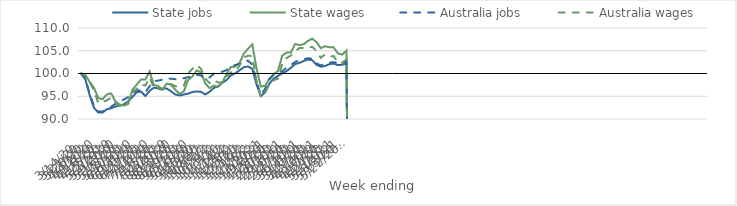
| Category | State jobs | State wages | Australia jobs | Australia wages |
|---|---|---|---|---|
| 14/03/2020 | 100 | 100 | 100 | 100 |
| 21/03/2020 | 98.645 | 99.612 | 98.971 | 99.605 |
| 28/03/2020 | 95.23 | 98.177 | 95.467 | 98.107 |
| 04/04/2020 | 92.458 | 96.854 | 92.92 | 96.258 |
| 11/04/2020 | 91.412 | 94.587 | 91.648 | 93.491 |
| 18/04/2020 | 91.415 | 94.369 | 91.631 | 93.694 |
| 25/04/2020 | 92.14 | 95.412 | 92.162 | 94.113 |
| 02/05/2020 | 92.362 | 95.687 | 92.658 | 94.675 |
| 09/05/2020 | 92.731 | 93.881 | 93.343 | 93.583 |
| 16/05/2020 | 92.971 | 93.182 | 93.936 | 92.817 |
| 23/05/2020 | 93.228 | 92.931 | 94.293 | 92.47 |
| 30/05/2020 | 93.894 | 93.318 | 94.8 | 93.82 |
| 06/06/2020 | 94.862 | 96.443 | 95.784 | 95.934 |
| 13/06/2020 | 95.893 | 97.556 | 96.283 | 96.613 |
| 20/06/2020 | 96.026 | 98.698 | 96.299 | 97.596 |
| 27/06/2020 | 95.046 | 98.676 | 95.908 | 97.351 |
| 04/07/2020 | 96.188 | 100.46 | 97.201 | 99.182 |
| 11/07/2020 | 96.879 | 97.457 | 98.328 | 96.791 |
| 18/07/2020 | 96.75 | 97.266 | 98.432 | 96.609 |
| 25/07/2020 | 96.654 | 96.48 | 98.653 | 96.408 |
| 01/08/2020 | 96.705 | 97.768 | 98.875 | 97.263 |
| 08/08/2020 | 96.089 | 97.528 | 98.872 | 97.698 |
| 15/08/2020 | 95.382 | 96.436 | 98.757 | 97.212 |
| 22/08/2020 | 95.169 | 95.517 | 98.844 | 97.073 |
| 29/08/2020 | 95.382 | 96.082 | 98.982 | 97.295 |
| 05/09/2020 | 95.578 | 98.534 | 99.167 | 100.035 |
| 12/09/2020 | 95.922 | 99.364 | 99.586 | 101.016 |
| 19/09/2020 | 96.056 | 100.663 | 99.757 | 101.878 |
| 26/09/2020 | 95.976 | 100.264 | 99.556 | 101.032 |
| 03/10/2020 | 95.4 | 97.844 | 98.852 | 98.907 |
| 10/10/2020 | 95.984 | 96.793 | 99.105 | 97.892 |
| 17/10/2020 | 96.819 | 97.346 | 99.955 | 98.589 |
| 24/10/2020 | 97.188 | 97.065 | 100.247 | 98.012 |
| 31/10/2020 | 97.953 | 98.015 | 100.384 | 98.084 |
| 07/11/2020 | 98.586 | 99.946 | 100.771 | 99.334 |
| 14/11/2020 | 99.582 | 101.418 | 101.516 | 100.252 |
| 21/11/2020 | 100.051 | 101.513 | 101.84 | 100.323 |
| 28/11/2020 | 100.675 | 102.274 | 102.16 | 101.68 |
| 05/12/2020 | 101.371 | 104.35 | 102.718 | 103.493 |
| 12/12/2020 | 101.554 | 105.429 | 102.789 | 103.93 |
| 19/12/2020 | 101.016 | 106.401 | 101.986 | 103.809 |
| 26/12/2020 | 97.585 | 101.1 | 98.188 | 98.338 |
| 02/01/2021 | 95.045 | 97.14 | 95.282 | 94.812 |
| 09/01/2021 | 95.855 | 97.301 | 96.645 | 95.793 |
| 16/01/2021 | 97.781 | 98.888 | 98.738 | 97.83 |
| 23/01/2021 | 98.866 | 99.832 | 99.703 | 98.519 |
| 30/01/2021 | 99.468 | 100.54 | 100.182 | 98.873 |
| 06/02/2021 | 100.054 | 103.952 | 100.516 | 102.171 |
| 13/02/2021 | 100.535 | 104.59 | 101.256 | 103.38 |
| 20/02/2021 | 101.247 | 104.598 | 101.855 | 103.943 |
| 27/02/2021 | 102.093 | 106.491 | 102.556 | 104.829 |
| 06/03/2021 | 102.311 | 106.236 | 102.809 | 105.611 |
| 13/03/2021 | 102.769 | 106.44 | 103.171 | 105.63 |
| 20/03/2021 | 103.08 | 107.155 | 103.339 | 105.616 |
| 27/03/2021 | 102.931 | 107.656 | 103.246 | 105.876 |
| 03/04/2021 | 101.932 | 106.929 | 102.251 | 104.958 |
| 10/04/2021 | 101.499 | 105.567 | 101.76 | 103.45 |
| 17/04/2021 | 101.644 | 105.995 | 102.161 | 104.184 |
| 24/04/2021 | 102.041 | 105.781 | 102.386 | 103.705 |
| 01/05/2021 | 102.187 | 105.76 | 102.495 | 103.842 |
| 08/05/2021 | 101.841 | 104.427 | 102.264 | 102.466 |
| 15/05/2021 | 101.927 | 104.138 | 102.191 | 102.371 |
| 22/05/2021 | 102.231 | 105.044 | 102.592 | 103.091 |